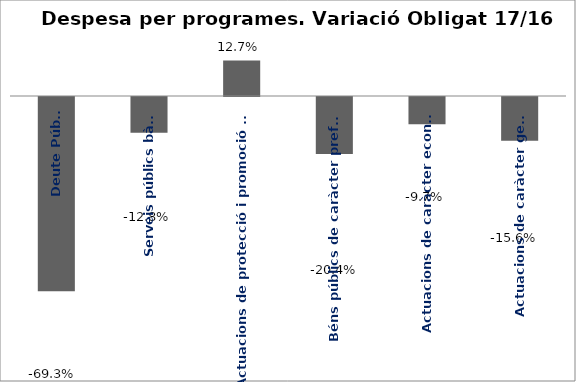
| Category | Series 0 |
|---|---|
| Deute Públic | -0.693 |
| Serveis públics bàsics | -0.128 |
| Actuacions de protecció i promoció social | 0.127 |
| Béns públics de caràcter preferent | -0.204 |
| Actuacions de caràcter econòmic | -0.097 |
| Actuacions de caràcter general | -0.156 |